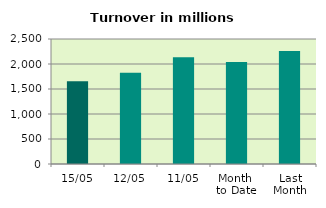
| Category | Series 0 |
|---|---|
| 15/05 | 1656.728 |
| 12/05 | 1824.599 |
| 11/05 | 2134.341 |
| Month 
to Date | 2041.167 |
| Last
Month | 2261.282 |